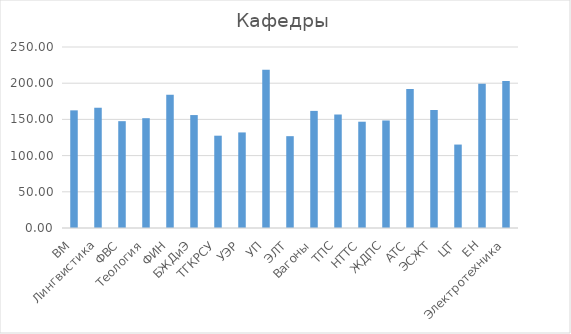
| Category | Series 0 |
|---|---|
| ВМ | 162.5 |
| Лингвистика | 166.111 |
| ФВС | 147.556 |
| Теология | 151.667 |
| ФИН | 184 |
| БЖДиЭ | 156 |
| ТГКРСУ | 127.5 |
| УЭР | 132 |
| УП | 218.5 |
| ЭЛТ | 126.833 |
| Вагоны | 161.75 |
| ТПС | 156.75 |
| НТТС | 146.8 |
| ЖДПС | 148.5 |
| АТС | 191.857 |
| ЭСЖТ | 163 |
| ЦТ | 115.25 |
| ЕН | 199.167 |
| Электротехника | 203 |